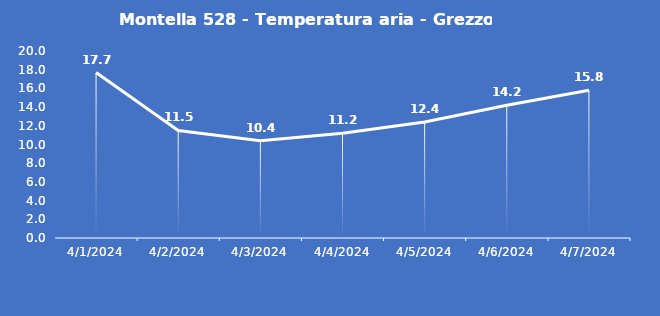
| Category | Montella 528 - Temperatura aria - Grezzo (°C) |
|---|---|
| 4/1/24 | 17.7 |
| 4/2/24 | 11.5 |
| 4/3/24 | 10.4 |
| 4/4/24 | 11.2 |
| 4/5/24 | 12.4 |
| 4/6/24 | 14.2 |
| 4/7/24 | 15.8 |